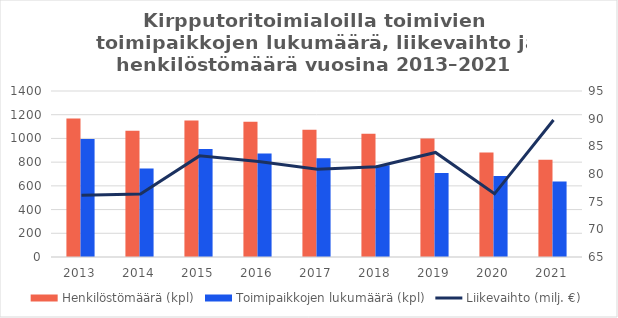
| Category | Henkilöstömäärä (kpl) | Toimipaikkojen lukumäärä (kpl) |
|---|---|---|
| 2013.0 | 1168.092 | 995 |
| 2014.0 | 1064.711 | 747 |
| 2015.0 | 1150.482 | 910 |
| 2016.0 | 1140.548 | 872 |
| 2017.0 | 1073.927 | 832 |
| 2018.0 | 1040.315 | 774 |
| 2019.0 | 998.611 | 708 |
| 2020.0 | 880.602 | 684 |
| 2021.0 | 819.75 | 637 |